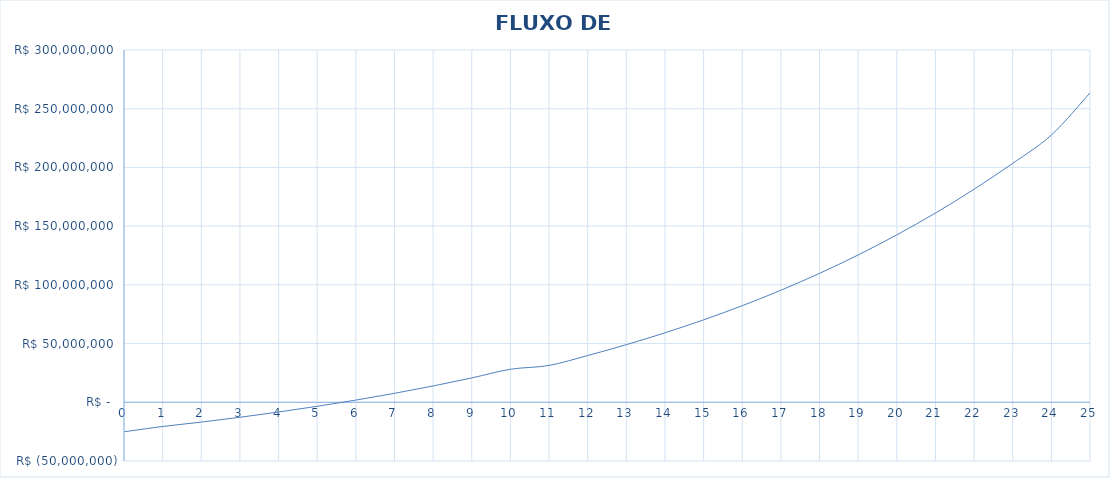
| Category | Series 0 |
|---|---|
| 0.0 | -25120949.729 |
| 1.0 | -20633382.513 |
| 2.0 | -16856951.897 |
| 3.0 | -12745322.105 |
| 4.0 | -8284175.168 |
| 5.0 | -3423902.206 |
| 6.0 | 1866268.886 |
| 7.0 | 7633108.165 |
| 8.0 | 13897147.864 |
| 9.0 | 20735750.711 |
| 10.0 | 28109795.912 |
| 11.0 | 31378825.154 |
| 12.0 | 39826343.617 |
| 13.0 | 49063706.798 |
| 14.0 | 59161297.736 |
| 15.0 | 70195497.768 |
| 16.0 | 82249209.102 |
| 17.0 | 95412377.259 |
| 18.0 | 109782585.304 |
| 19.0 | 125465679.796 |
| 20.0 | 142576461.783 |
| 21.0 | 161148968.719 |
| 22.0 | 181408625.459 |
| 23.0 | 203501769.908 |
| 24.0 | 227587021.202 |
| 25.0 | 263499375.916 |